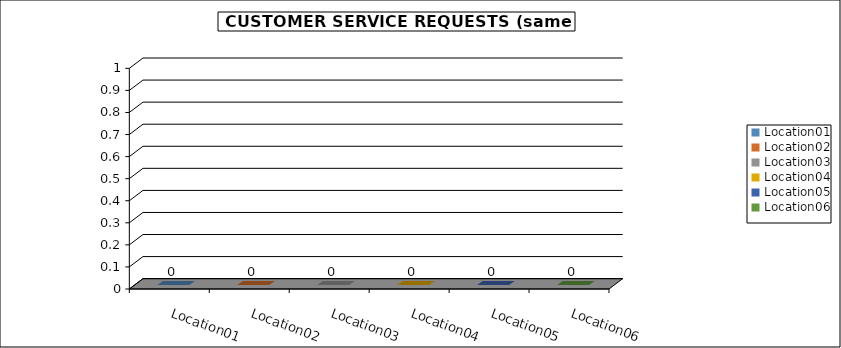
| Category | Series 0 |
|---|---|
| Location01 | 0 |
| Location02 | 0 |
| Location03 | 0 |
| Location04 | 0 |
| Location05 | 0 |
| Location06 | 0 |